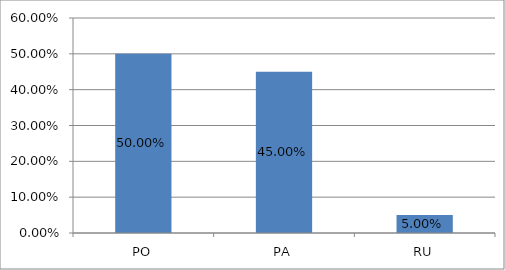
| Category | Series 0 |
|---|---|
| PO | 0.5 |
| PA | 0.45 |
| RU | 0.05 |